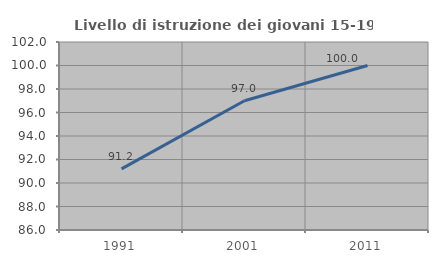
| Category | Livello di istruzione dei giovani 15-19 anni |
|---|---|
| 1991.0 | 91.2 |
| 2001.0 | 97 |
| 2011.0 | 100 |